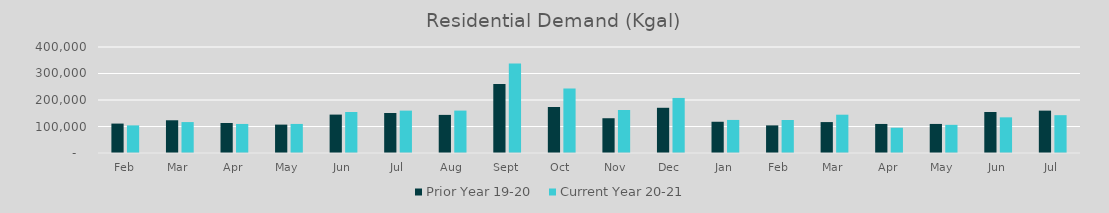
| Category | Prior Year 19-20  | Current Year 20-21 |
|---|---|---|
| Feb | 111009.962 | 104204.224 |
| Mar | 123525.131 | 116687.491 |
| Apr | 113258.787 | 109598.965 |
| May | 107128.051 | 109656.015 |
| Jun | 144930.453 | 154696.236 |
| Jul | 151028.014 | 159889.353 |
| Aug | 143816.337 | 160013.985 |
| Sep | 260607.456 | 337995.641 |
| Oct | 173601.368 | 243049.084 |
| Nov | 131198.833 | 162175.563 |
| Dec | 170629.384 | 207737.904 |
| Jan | 117899.625 | 124779.797 |
| Feb | 104204.224 | 124538.238 |
| Mar | 116687.491 | 144510.137 |
| Apr | 109598.965 | 95313.825 |
| May | 109656.015 | 106271.913 |
| Jun | 154696.236 | 134556.172 |
| Jul | 159889.353 | 142779.003 |